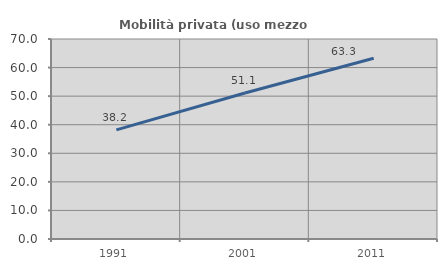
| Category | Mobilità privata (uso mezzo privato) |
|---|---|
| 1991.0 | 38.202 |
| 2001.0 | 51.086 |
| 2011.0 | 63.265 |